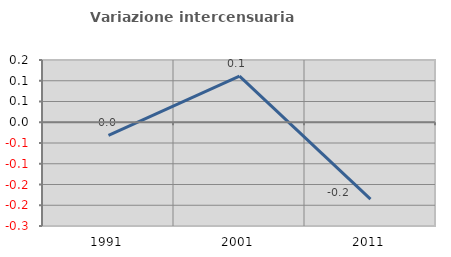
| Category | Variazione intercensuaria annua |
|---|---|
| 1991.0 | -0.031 |
| 2001.0 | 0.111 |
| 2011.0 | -0.185 |